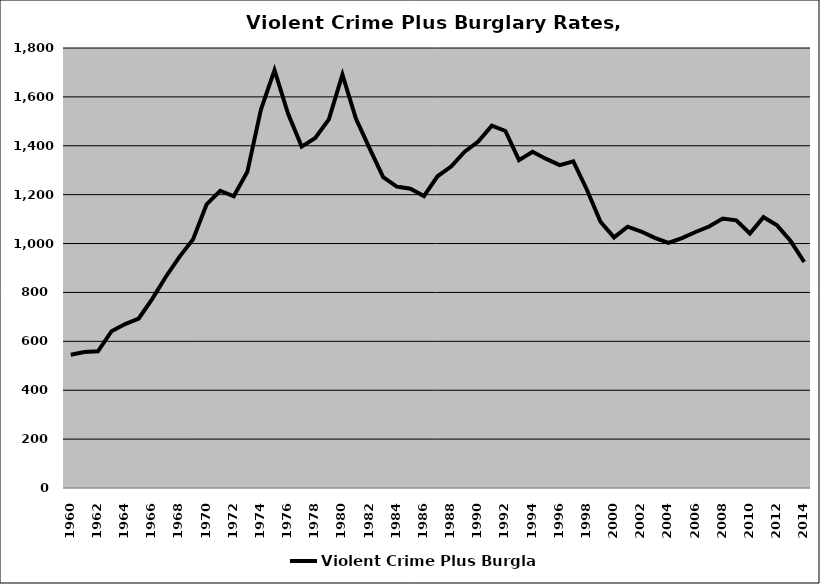
| Category | Violent Crime Plus Burglary |
|---|---|
| 1960.0 | 545.437 |
| 1961.0 | 556.273 |
| 1962.0 | 559.364 |
| 1963.0 | 641.521 |
| 1964.0 | 670.694 |
| 1965.0 | 693.408 |
| 1966.0 | 773.79 |
| 1967.0 | 864.34 |
| 1968.0 | 945.767 |
| 1969.0 | 1017.136 |
| 1970.0 | 1160.413 |
| 1971.0 | 1216.06 |
| 1972.0 | 1193.498 |
| 1973.0 | 1293.454 |
| 1974.0 | 1547.861 |
| 1975.0 | 1709.283 |
| 1976.0 | 1530.951 |
| 1977.0 | 1396.754 |
| 1978.0 | 1431.783 |
| 1979.0 | 1507.963 |
| 1980.0 | 1691.105 |
| 1981.0 | 1510.41 |
| 1982.0 | 1389.38 |
| 1983.0 | 1272.02 |
| 1984.0 | 1233.176 |
| 1985.0 | 1224.023 |
| 1986.0 | 1194.386 |
| 1987.0 | 1275.212 |
| 1988.0 | 1315.229 |
| 1989.0 | 1375.577 |
| 1990.0 | 1417.203 |
| 1991.0 | 1482.406 |
| 1992.0 | 1460.579 |
| 1993.0 | 1341.117 |
| 1994.0 | 1375.626 |
| 1995.0 | 1346.321 |
| 1996.0 | 1320.801 |
| 1997.0 | 1336.306 |
| 1998.0 | 1220.122 |
| 1999.0 | 1089.098 |
| 2000.0 | 1025.214 |
| 2001.0 | 1068.953 |
| 2002.0 | 1049.325 |
| 2003.0 | 1023.039 |
| 2004.0 | 1003.158 |
| 2005.0 | 1022.308 |
| 2006.0 | 1047.387 |
| 2007.0 | 1069.849 |
| 2008.0 | 1102.404 |
| 2009.0 | 1095.03 |
| 2010.0 | 1041.118 |
| 2011.0 | 1107.828 |
| 2012.0 | 1074.263 |
| 2013.0 | 1010.256 |
| 2014.0 | 924.562 |